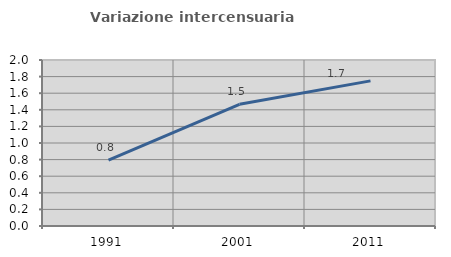
| Category | Variazione intercensuaria annua |
|---|---|
| 1991.0 | 0.794 |
| 2001.0 | 1.466 |
| 2011.0 | 1.748 |